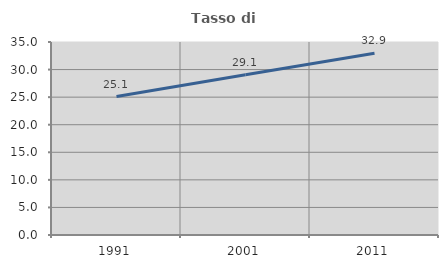
| Category | Tasso di occupazione   |
|---|---|
| 1991.0 | 25.111 |
| 2001.0 | 29.065 |
| 2011.0 | 32.942 |